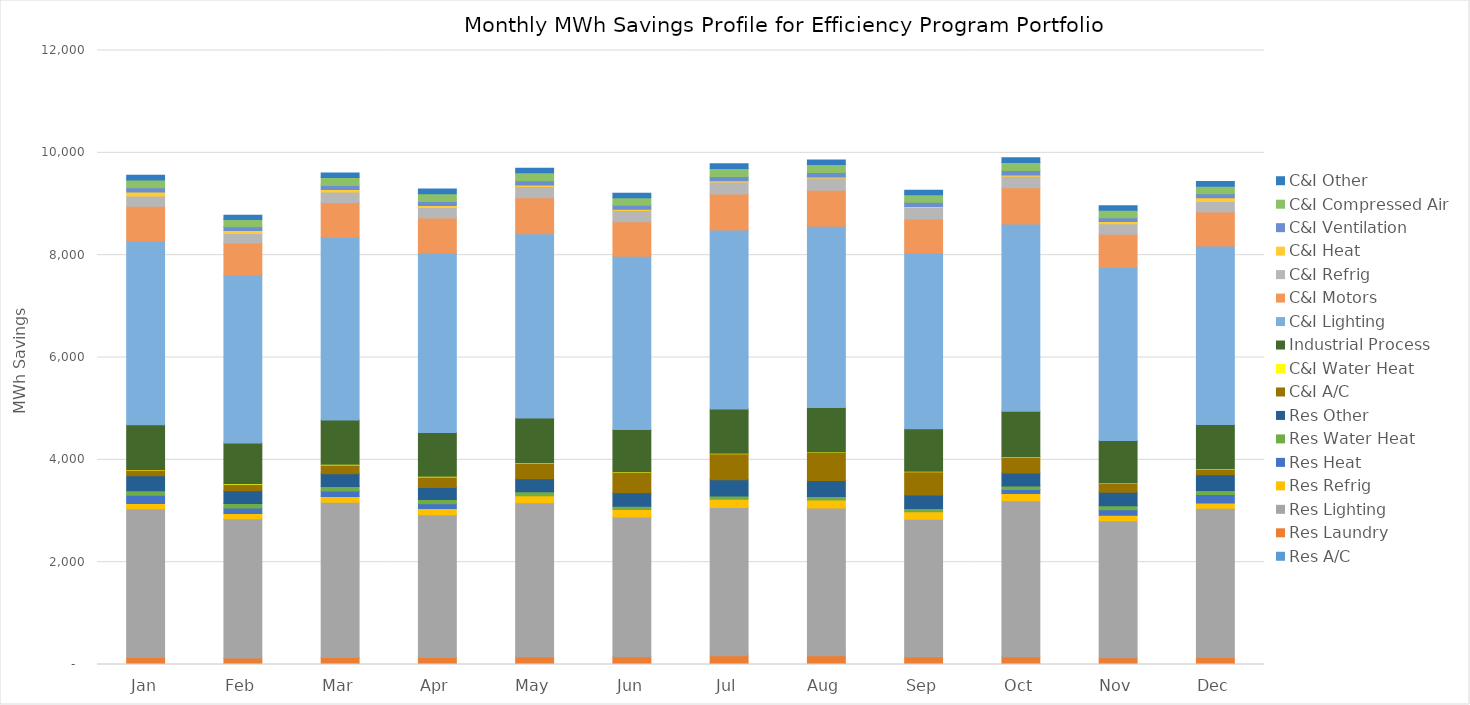
| Category | Res A/C | Res Laundry | Res Lighting | Res Refrig | Res Heat | Res Water Heat | Res Other | C&I A/C | C&I Water Heat | Industrial Process | C&I Lighting | C&I Motors | C&I Refrig | C&I Heat | C&I Ventilation | C&I Compressed Air | C&I Other |
|---|---|---|---|---|---|---|---|---|---|---|---|---|---|---|---|---|---|
| Jan | 4.296 | 132.628 | 2904.856 | 104.448 | 160.078 | 91.106 | 290.253 | 112.005 | 13.015 | 873.993 | 3584.662 | 684.511 | 201.94 | 78.205 | 81.33 | 153.072 | 92.244 |
| Feb | 3.031 | 121.662 | 2724.649 | 100.036 | 110.964 | 85.441 | 249.7 | 123.46 | 12.117 | 796.624 | 3283.25 | 626.829 | 186.232 | 56.888 | 73.816 | 140.031 | 84.404 |
| Mar | 2.692 | 133.948 | 3034.579 | 114.316 | 103.063 | 90.923 | 250.897 | 170.724 | 13.227 | 865.661 | 3566.806 | 680.805 | 207.889 | 47.753 | 79.798 | 153.218 | 91.424 |
| Apr | 4.175 | 130.932 | 2793.524 | 119.684 | 91.901 | 82.503 | 237.328 | 206.798 | 12.214 | 853.915 | 3515.166 | 676.037 | 205.634 | 40.088 | 79.058 | 152.631 | 89.534 |
| May | 8.278 | 137.304 | 3016.782 | 133.293 | 0 | 80.528 | 254.294 | 306.674 | 12.414 | 870.417 | 3596.879 | 704.622 | 219.865 | 28.83 | 82.909 | 155.292 | 92.249 |
| Jun | 15.476 | 137.714 | 2730.276 | 143.484 | 0 | 66.826 | 260.688 | 401.228 | 10.844 | 826.792 | 3387.603 | 673.519 | 219.013 | 22.346 | 82.029 | 146.478 | 87.786 |
| Jul | 24.654 | 147.139 | 2898.935 | 159.581 | 0 | 64.868 | 313.511 | 508.875 | 10.723 | 863.813 | 3501.269 | 702.588 | 236.332 | 20.266 | 87.206 | 153.477 | 91.023 |
| Aug | 23.275 | 146.215 | 2890.063 | 156.889 | 0 | 67.703 | 310.749 | 548.551 | 10.518 | 868.015 | 3541.946 | 704.901 | 237.952 | 19.14 | 89.306 | 154.797 | 91.594 |
| Sep | 12.778 | 134.021 | 2694.23 | 143 | 0 | 66.107 | 260.957 | 455.717 | 10.071 | 831.428 | 3427.074 | 670.273 | 225.66 | 19.385 | 83.776 | 147.02 | 88.362 |
| Oct | 8.007 | 136.959 | 3056.043 | 142.826 | 75.591 | 67.703 | 255.038 | 314.354 | 10.711 | 882.775 | 3659.451 | 707.389 | 223.941 | 27.534 | 84.222 | 159.73 | 93.419 |
| Nov | 2.633 | 128.168 | 2676.961 | 110.582 | 107.412 | 75.318 | 265.688 | 169.187 | 10.939 | 828.707 | 3384.808 | 649.591 | 205.347 | 41.828 | 75.564 | 145.989 | 87.794 |
| Dec | 4.104 | 132.019 | 2918.65 | 103.301 | 163.991 | 78.773 | 307.896 | 111.737 | 12.206 | 857.861 | 3487.084 | 667.535 | 202.693 | 73.737 | 79.186 | 147.872 | 90.168 |